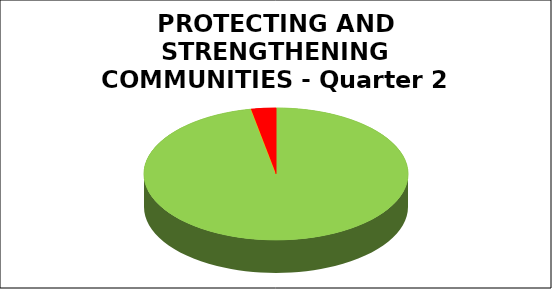
| Category | Series 0 |
|---|---|
| Green | 0.97 |
| Amber | 0 |
| Red | 0.03 |